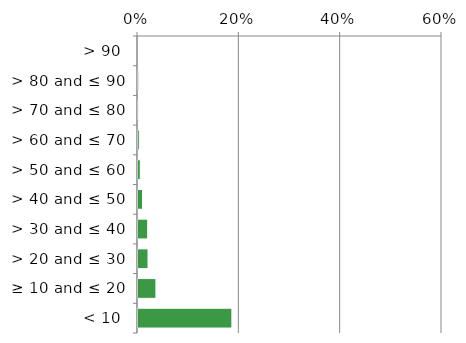
| Category | Non native |
|---|---|
| < 10 | 0.187 |
| ≥ 10 and ≤ 20 | 0.037 |
| > 20 and ≤ 30 | 0.022 |
| > 30 and ≤ 40 | 0.021 |
| > 40 and ≤ 50 | 0.011 |
| > 50 and ≤ 60 | 0.007 |
| > 60 and ≤ 70 | 0.005 |
| > 70 and ≤ 80 | 0.003 |
| > 80 and ≤ 90 | 0.004 |
| > 90 | 0 |